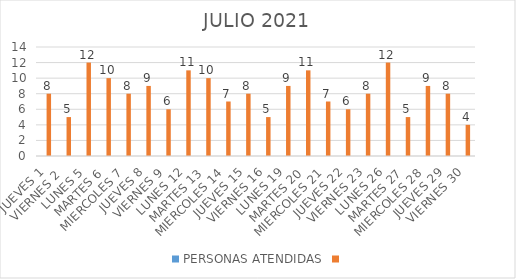
| Category | PERSONAS ATENDIDAS | Series 1 |
|---|---|---|
| JUEVES 1 |  | 8 |
| VIERNES 2  |  | 5 |
| LUNES 5 |  | 12 |
| MARTES 6 |  | 10 |
| MIERCOLES 7 |  | 8 |
| JUEVES 8 |  | 9 |
| VIERNES 9 |  | 6 |
| LUNES 12 |  | 11 |
| MARTES 13 |  | 10 |
| MIERCOLES 14 |  | 7 |
| JUEVES 15 |  | 8 |
| VIERNES 16 |  | 5 |
| LUNES 19 |  | 9 |
| MARTES 20 |  | 11 |
| MIERCOLES 21 |  | 7 |
| JUEVES 22 |  | 6 |
| VIERNES 23 |  | 8 |
| LUNES 26 |  | 12 |
| MARTES 27 |  | 5 |
| MIERCOLES 28 |  | 9 |
| JUEVES 29 |  | 8 |
| VIERNES 30 |  | 4 |